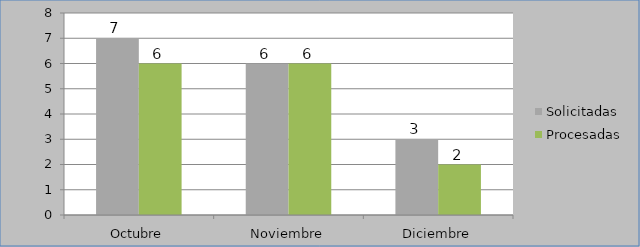
| Category | Solicitadas | Procesadas |
|---|---|---|
| Octubre | 7 | 6 |
| Noviembre | 6 | 6 |
| Diciembre | 3 | 2 |